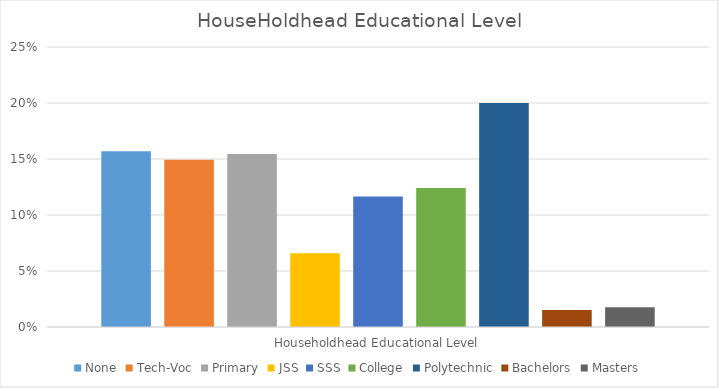
| Category | None | Tech-Voc | Primary | JSS | SSS | College | Polytechnic | Bachelors | Masters |
|---|---|---|---|---|---|---|---|---|---|
| Householdhead Educational Level | 0.157 | 0.149 | 0.154 | 0.066 | 0.116 | 0.124 | 0.2 | 0.015 | 0.018 |